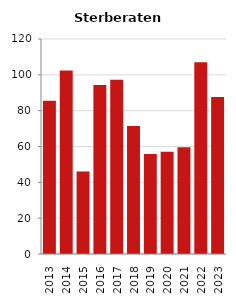
| Category | Sterberate der Bevölkerung ab 80 Jahre (auf Tsd.) |
|---|---|
| 2013.0 | 85.47 |
| 2014.0 | 102.459 |
| 2015.0 | 45.977 |
| 2016.0 | 94.34 |
| 2017.0 | 97.276 |
| 2018.0 | 71.429 |
| 2019.0 | 55.749 |
| 2020.0 | 57.047 |
| 2021.0 | 59.561 |
| 2022.0 | 107.034 |
| 2023.0 | 87.613 |